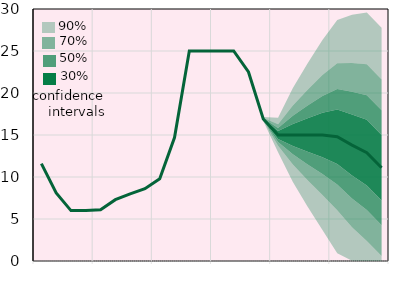
| Category | Облікова ставка, % |
|---|---|
|  | 11.6 |
|  | 8.1 |
|  | 6 |
| IV.20 | 6 |
|  | 6.1 |
|  | 7.3 |
|  | 8 |
| IV.21 | 8.6 |
|  | 9.8 |
|  | 14.7 |
|  | 25 |
| IV.22 | 25 |
|  | 25 |
|  | 25 |
|  | 22.5 |
| IV.23 | 16.9 |
|  | 15 |
|  | 15 |
|  | 15 |
| IV.24 | 15 |
|  | 14.8 |
|  | 13.8 |
|  | 12.9 |
| IV.25 | 11.1 |